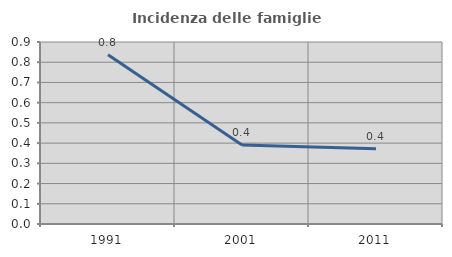
| Category | Incidenza delle famiglie numerose |
|---|---|
| 1991.0 | 0.837 |
| 2001.0 | 0.391 |
| 2011.0 | 0.372 |